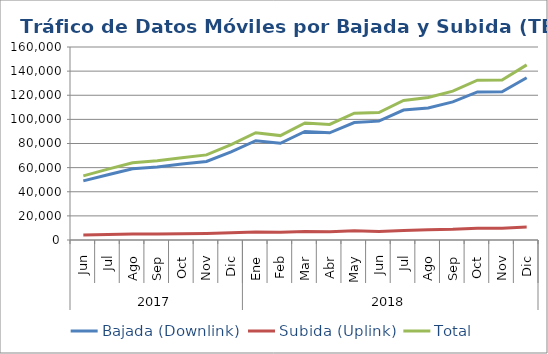
| Category | Bajada (Downlink) | Subida (Uplink) | Total |
|---|---|---|---|
| 0 | 49031.05 | 4110.083 | 53141.133 |
| 1 | 54144.662 | 4576.336 | 58720.998 |
| 2 | 59053.884 | 4926.59 | 63980.475 |
| 3 | 60615.603 | 5073.856 | 65689.46 |
| 4 | 62912.282 | 5241.949 | 68154.232 |
| 5 | 65116.652 | 5430.774 | 70547.426 |
| 6 | 73085.593 | 5979.615 | 79065.208 |
| 7 | 82305.176 | 6615.846 | 88921.022 |
| 8 | 80168.923 | 6368.904 | 86537.828 |
| 9 | 90017.001 | 6987.156 | 97004.158 |
| 10 | 88889.971 | 6928.309 | 95818.281 |
| 11 | 97402.04 | 7732.528 | 105134.568 |
| 12 | 98551.021 | 7120.622 | 105671.643 |
| 13 | 107733.178 | 7900.363 | 115633.541 |
| 14 | 109511.382 | 8593.744 | 118105.127 |
| 15 | 114524.119 | 8898.102 | 123422.221 |
| 16 | 122756.479 | 9706.983 | 132463.462 |
| 17 | 122842.407 | 9785.473 | 132627.88 |
| 18 | 134504.781 | 10675.628 | 145180.409 |